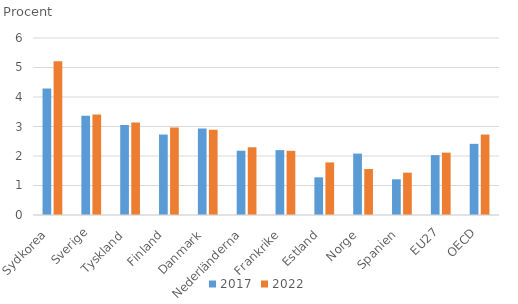
| Category | 2017 | 2022 |
|---|---|---|
| Sydkorea  | 4.292 | 5.211 |
| Sverige | 3.363 | 3.408 |
| Tyskland  | 3.047 | 3.132 |
| Finland  | 2.728 | 2.965 |
| Danmark  | 2.931 | 2.891 |
| Nederländerna  | 2.179 | 2.296 |
| Frankrike  | 2.199 | 2.176 |
| Estland  | 1.277 | 1.782 |
| Norge  | 2.082 | 1.558 |
| Spanien  | 1.21 | 1.435 |
| EU27 | 2.031 | 2.114 |
| OECD | 2.412 | 2.727 |